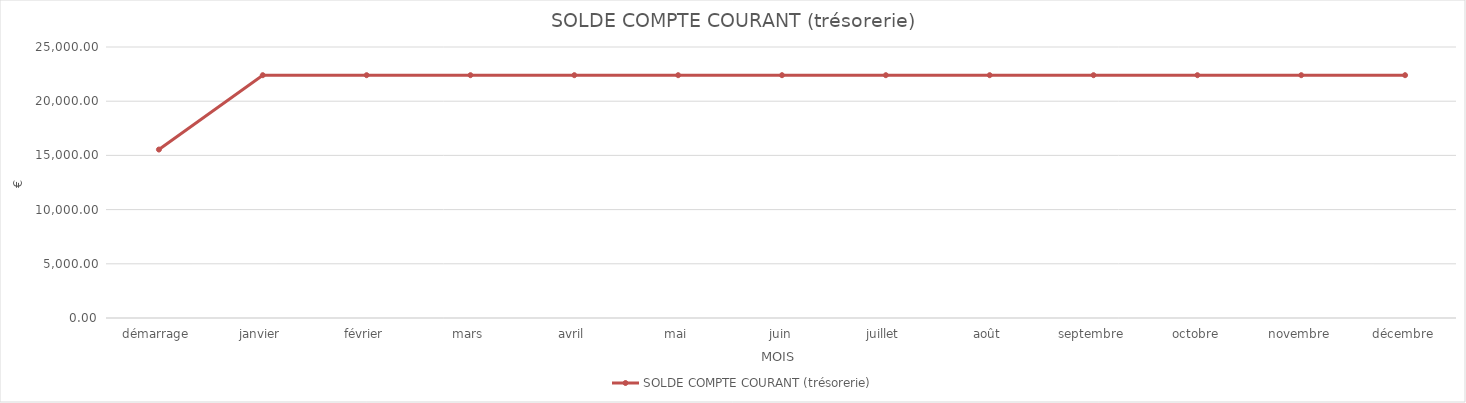
| Category | SOLDE COMPTE COURANT (trésorerie) |
|---|---|
| démarrage | 15540 |
| janvier | 22400 |
| février | 22400 |
| mars | 22400 |
| avril | 22400 |
| mai | 22400 |
| juin | 22400 |
| juillet | 22400 |
| août | 22400 |
| septembre | 22400 |
| octobre | 22400 |
| novembre | 22400 |
| décembre | 22400 |